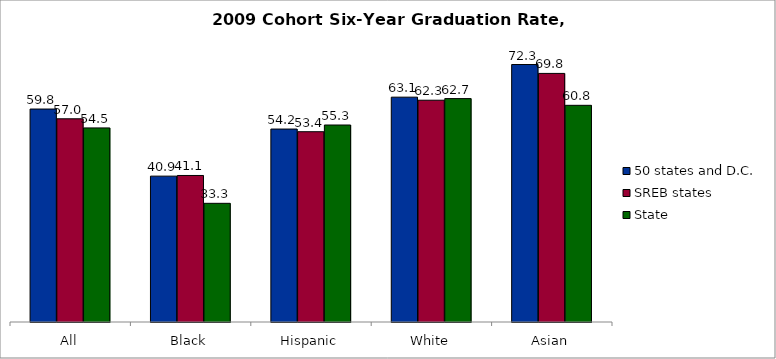
| Category | 50 states and D.C. | SREB states | State |
|---|---|---|---|
| All | 59.776 | 57.043 | 54.478 |
| Black | 40.945 | 41.132 | 33.314 |
| Hispanic | 54.159 | 53.414 | 55.296 |
| White | 63.111 | 62.253 | 62.709 |
| Asian | 72.274 | 69.78 | 60.822 |